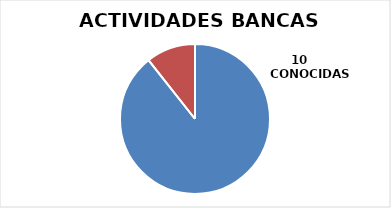
| Category | Series 0 |
|---|---|
| 0 | 84 |
| 1 | 10 |